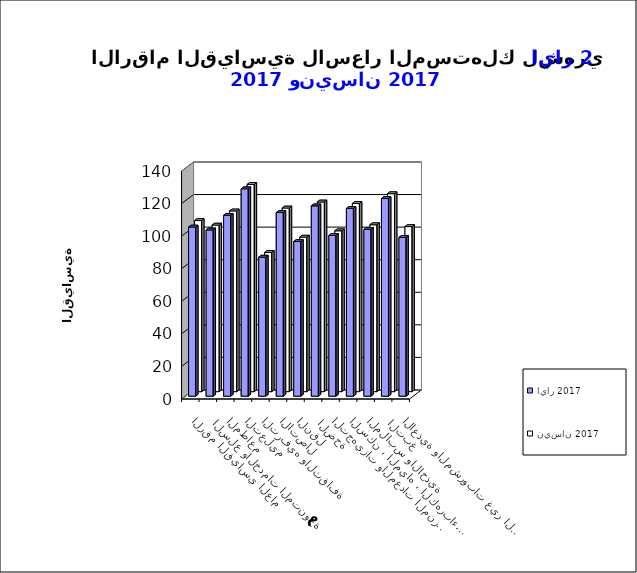
| Category | ايار 2017      | نيسان 2017       |
|---|---|---|
| الاغذية والمشروبات غير الكحولية | 97.5 | 101.4 |
|  التبغ | 121.4 | 121.6 |
| الملابس والاحذية | 102.4 | 102.5 |
| السكن ، المياه ، الكهرباء، الغاز  | 115.3 | 115.6 |
| التجهيزات والمعدات المنزلية والصيانة | 98.7 | 98.8 |
|  الصحة | 116.9 | 116.5 |
| النقل | 95 | 94.9 |
| الاتصال | 112.8 | 112.8 |
| الترفيه والثقافة | 85.4 | 85.5 |
| التعليم | 127.4 | 127.3 |
| المطاعم  | 111.1 | 111 |
|  السلع والخدمات المتنوعة | 102.1 | 102.3 |
| الرقم القياسي العام | 103.9 | 105.1 |